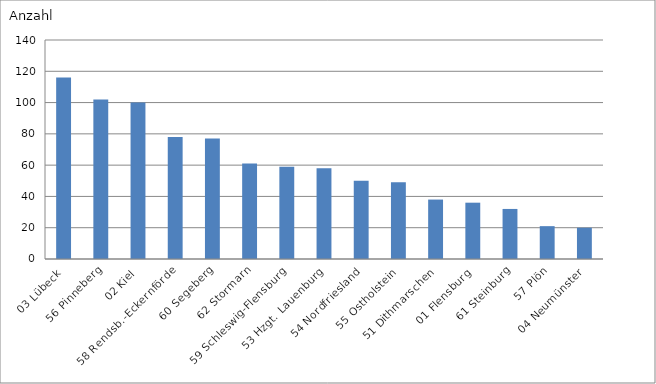
| Category | 03 Lübeck |
|---|---|
| 03 Lübeck | 116 |
| 56 Pinneberg | 102 |
| 02 Kiel | 100 |
| 58 Rendsb.-Eckernförde | 78 |
| 60 Segeberg | 77 |
| 62 Stormarn | 61 |
| 59 Schleswig-Flensburg | 59 |
| 53 Hzgt. Lauenburg | 58 |
| 54 Nordfriesland | 50 |
| 55 Ostholstein | 49 |
| 51 Dithmarschen | 38 |
| 01 Flensburg | 36 |
| 61 Steinburg | 32 |
| 57 Plön | 21 |
| 04 Neumünster | 20 |